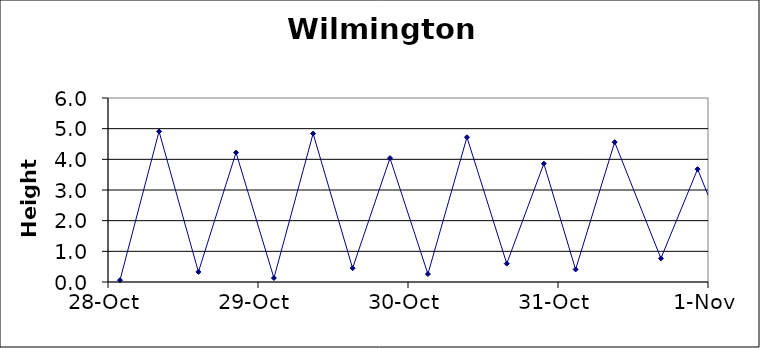
| Category | Height |
|---|---|
| 38288.07986111111 | 0.06 |
| 38288.34027777778 | 4.91 |
| 38288.60277777778 | 0.33 |
| 38288.853472222225 | 4.22 |
| 38289.10625 | 0.13 |
| 38289.36736111111 | 4.84 |
| 38289.63055555556 | 0.45 |
| 38289.87986111111 | 4.04 |
| 38290.13263888889 | 0.26 |
| 38290.393055555556 | 4.72 |
| 38290.65833333333 | 0.6 |
| 38290.90555555555 | 3.86 |
| 38291.11736111111 | 0.41 |
| 38291.37777777778 | 4.56 |
| 38291.686111111114 | 0.77 |
| 38291.930555555555 | 3.68 |
| 38292.186111111114 | 0.58 |